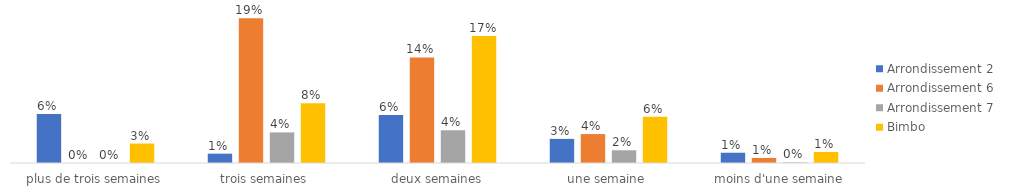
| Category | Arrondissement 2 | Arrondissement 6 | Arrondissement 7 | Bimbo |
|---|---|---|---|---|
| plus de trois semaines | 0.064 | 0 | 0 | 0.025 |
| trois semaines | 0.012 | 0.189 | 0.04 | 0.078 |
| deux semaines | 0.063 | 0.138 | 0.043 | 0.166 |
| une semaine | 0.032 | 0.038 | 0.017 | 0.061 |
| moins d'une semaine | 0.013 | 0.007 | 0.001 | 0.014 |